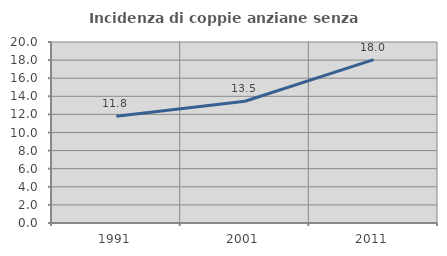
| Category | Incidenza di coppie anziane senza figli  |
|---|---|
| 1991.0 | 11.786 |
| 2001.0 | 13.454 |
| 2011.0 | 18.048 |